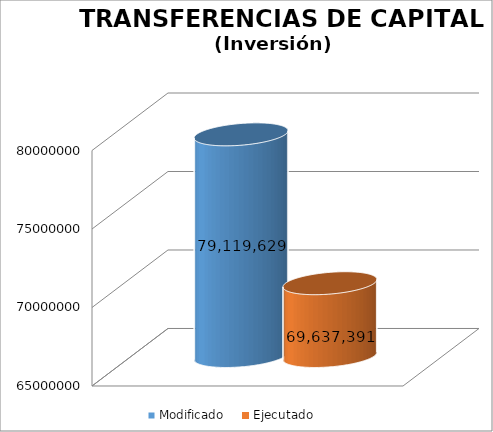
| Category | Modificado | Ejecutado |
|---|---|---|
| 0 | 79119629 | 69637390.57 |